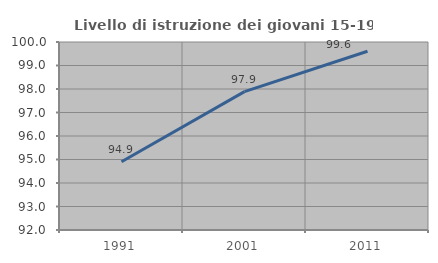
| Category | Livello di istruzione dei giovani 15-19 anni |
|---|---|
| 1991.0 | 94.903 |
| 2001.0 | 97.887 |
| 2011.0 | 99.608 |